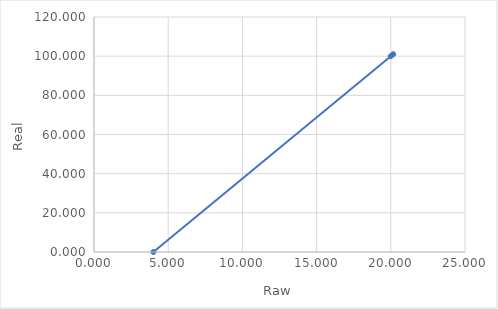
| Category | Real (y) |
|---|---|
| 4.0 | 0 |
| 20.0 | 100 |
| 20.16 | 101 |